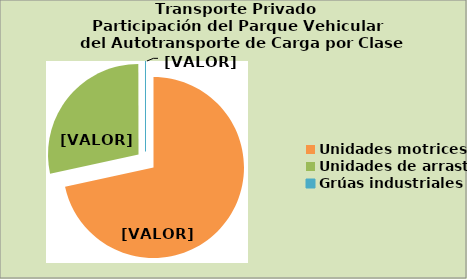
| Category | Series 0 |
|---|---|
| Unidades motrices | 71.605 |
| Unidades de arrastre | 28.365 |
| Grúas industriales | 0.03 |